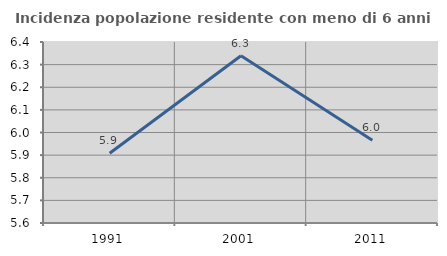
| Category | Incidenza popolazione residente con meno di 6 anni |
|---|---|
| 1991.0 | 5.908 |
| 2001.0 | 6.34 |
| 2011.0 | 5.966 |